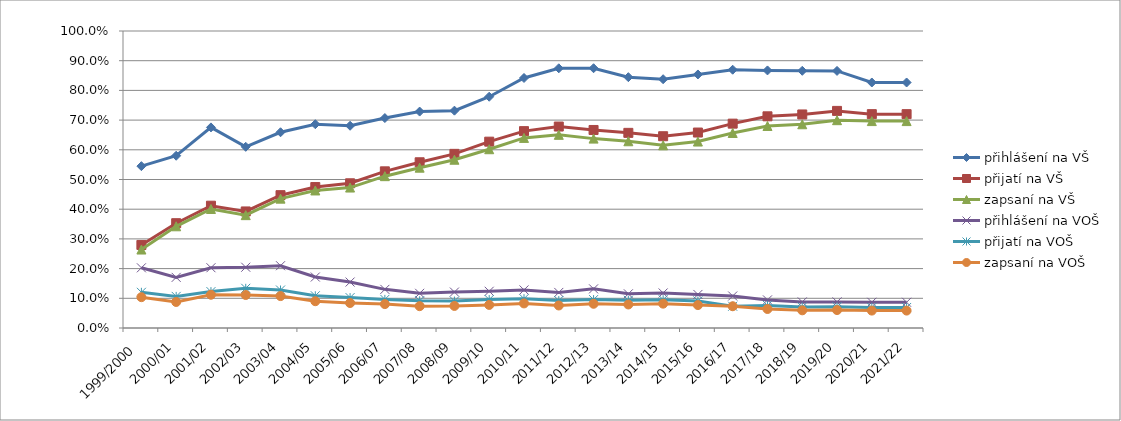
| Category | přihlášení na VŠ | přijatí na VŠ | zapsaní na VŠ | přihlášení na VOŠ | přijatí na VOŠ | zapsaní na VOŠ |
|---|---|---|---|---|---|---|
| 1999/2000 | 0.545 | 0.28 | 0.264 | 0.203 | 0.12 | 0.104 |
| 2000/01 | 0.58 | 0.353 | 0.342 | 0.17 | 0.106 | 0.088 |
| 2001/02 | 0.675 | 0.412 | 0.401 | 0.203 | 0.123 | 0.112 |
| 2002/03 | 0.61 | 0.392 | 0.38 | 0.205 | 0.134 | 0.111 |
| 2003/04 | 0.659 | 0.447 | 0.436 | 0.21 | 0.128 | 0.107 |
| 2004/05 | 0.686 | 0.475 | 0.463 | 0.172 | 0.108 | 0.09 |
| 2005/06 | 0.681 | 0.487 | 0.473 | 0.155 | 0.102 | 0.084 |
| 2006/07 | 0.707 | 0.527 | 0.511 | 0.13 | 0.096 | 0.08 |
| 2007/08 | 0.729 | 0.558 | 0.54 | 0.117 | 0.092 | 0.073 |
| 2008/09 | 0.732 | 0.586 | 0.567 | 0.121 | 0.091 | 0.074 |
| 2009/10 | 0.779 | 0.627 | 0.602 | 0.124 | 0.096 | 0.078 |
| 2010/11 | 0.842 | 0.663 | 0.64 | 0.128 | 0.099 | 0.083 |
| 2011/12 | 0.874 | 0.678 | 0.65 | 0.12 | 0.092 | 0.076 |
| 2012/13 | 0.875 | 0.667 | 0.638 | 0.132 | 0.096 | 0.082 |
| 2013/14 | 0.845 | 0.657 | 0.629 | 0.115 | 0.093 | 0.079 |
| 2014/15 | 0.838 | 0.646 | 0.615 | 0.118 | 0.095 | 0.082 |
| 2015/16 | 0.854 | 0.658 | 0.628 | 0.113 | 0.091 | 0.077 |
| 2016/17 | 0.87 | 0.688 | 0.657 | 0.108 | 0.073 | 0.073 |
| 2017/18 | 0.867 | 0.713 | 0.68 | 0.095 | 0.076 | 0.064 |
| 2018/19 | 0.866 | 0.719 | 0.686 | 0.088 | 0.071 | 0.06 |
| 2019/20 | 0.866 | 0.731 | 0.7 | 0.088 | 0.072 | 0.06 |
| 2020/21 | 0.827 | 0.72 | 0.697 | 0.087 | 0.069 | 0.059 |
| 2021/22 | 0.827 | 0.72 | 0.697 | 0.087 | 0.069 | 0.059 |